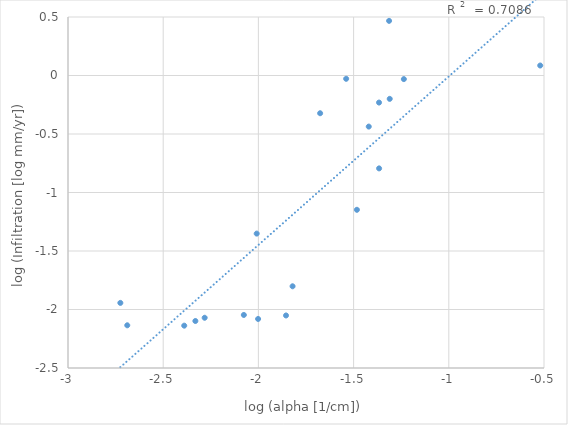
| Category | Series 0 |
|---|---|
| -2.282267141529558 | -2.071 |
| -2.076526605919158 | -2.047 |
| -2.6887478335368487 | -2.135 |
| -1.5390888813687433 | -0.028 |
| -1.3136325427122058 | 0.467 |
| -2.7250520680572428 | -1.944 |
| -1.8205280250582558 | -1.802 |
| -2.3309825044209433 | -2.098 |
| -2.0089292146904882 | -1.351 |
| -2.0015958744177667 | -2.081 |
| -1.2360475584527124 | -0.031 |
| -1.3664235691231619 | -0.231 |
| -1.8549436842625247 | -2.051 |
| -1.420400780858798 | -0.437 |
| -1.4826344093198824 | -1.148 |
| -1.6757656514385704 | -0.323 |
| -1.3102809018246075 | -0.2 |
| -2.3895600752789776 | -2.138 |
| -1.366094286163158 | -0.794 |
| -0.5198490421078452 | 0.085 |